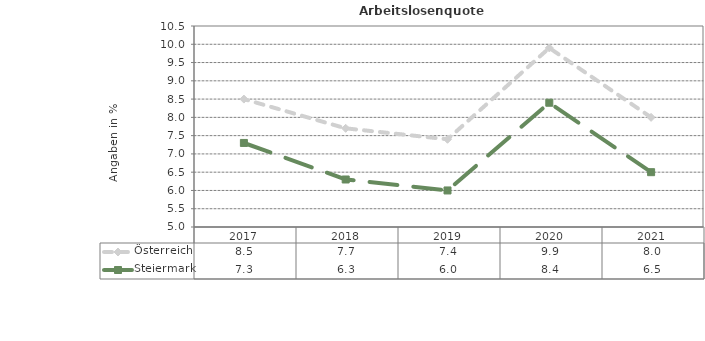
| Category | Österreich | Steiermark |
|---|---|---|
| 2021.0 | 8 | 6.5 |
| 2020.0 | 9.9 | 8.4 |
| 2019.0 | 7.4 | 6 |
| 2018.0 | 7.7 | 6.3 |
| 2017.0 | 8.5 | 7.3 |